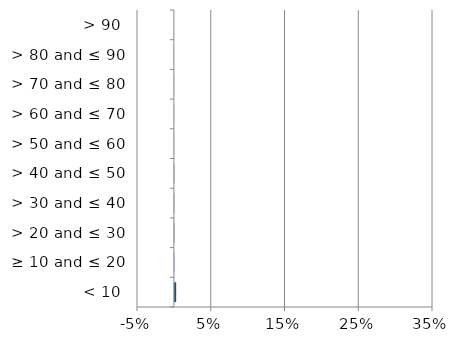
| Category | England | Scotland | Wales |
|---|---|---|---|
| < 10 | 0 | 0.003 | 0 |
| ≥ 10 and ≤ 20 | 0 | 0 | 0 |
| > 20 and ≤ 30 | 0 | 0.001 | 0 |
| > 30 and ≤ 40 | 0 | 0 | 0 |
| > 40 and ≤ 50 | 0 | 0 | 0 |
| > 50 and ≤ 60 | 0 | 0 | 0 |
| > 60 and ≤ 70 | 0 | 0 | 0 |
| > 70 and ≤ 80 | 0 | 0 | 0 |
| > 80 and ≤ 90 | 0 | 0 | 0 |
| > 90 | 0 | 0 | 0 |